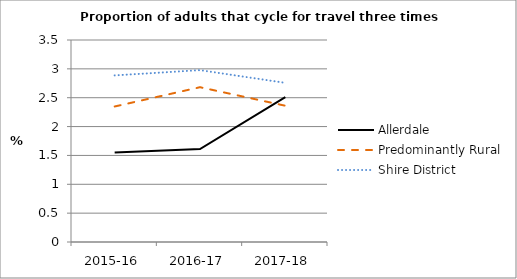
| Category | Allerdale | Predominantly Rural | Shire District |
|---|---|---|---|
| 2015-16 | 1.549 | 2.348 | 2.887 |
| 2016-17 | 1.612 | 2.682 | 2.978 |
| 2017-18 | 2.511 | 2.361 | 2.758 |